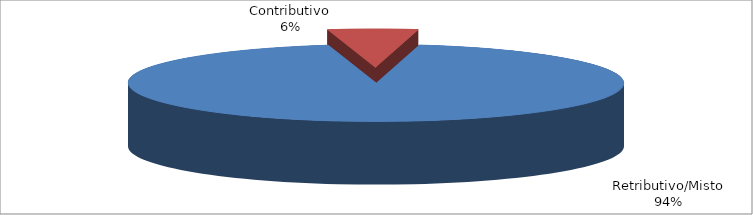
| Category | Decorrenti ANNO 2020 |
|---|---|
| Retributivo/Misto | 72768 |
| Contributivo | 4535 |